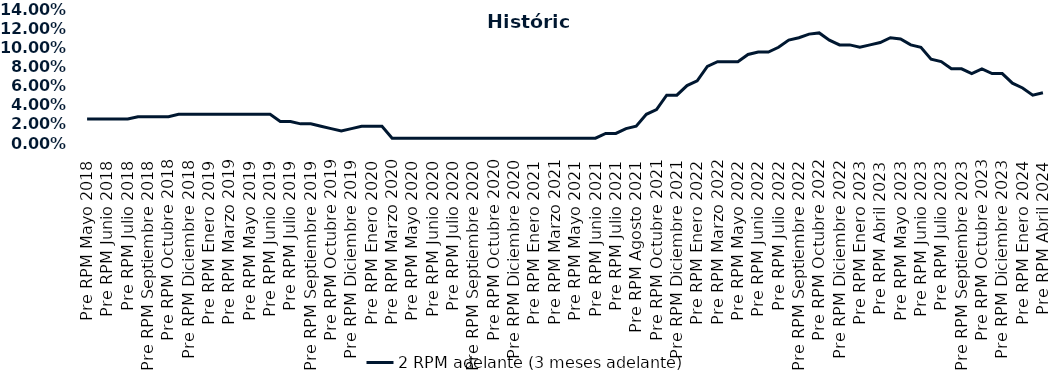
| Category | 2 RPM adelante (3 meses adelante) |
|---|---|
| Pre RPM Mayo 2018 | 0.025 |
| Post RPM Mayo 2018 | 0.025 |
| Pre RPM Junio 2018 | 0.025 |
| Post RPM Junio 2018 | 0.025 |
| Pre RPM Julio 2018 | 0.025 |
| Post RPM Julio 2018 | 0.028 |
| Pre RPM Septiembre 2018 | 0.028 |
| Post RPM Septiembre 2018 | 0.028 |
| Pre RPM Octubre 2018 | 0.028 |
| Post RPM Octubre 2018 | 0.03 |
| Pre RPM Diciembre 2018 | 0.03 |
| Post RPM Diciembre 2018 | 0.03 |
| Pre RPM Enero 2019 | 0.03 |
| Post RPM Enero 2019 | 0.03 |
| Pre RPM Marzo 2019 | 0.03 |
| Post RPM Marzo 2019 | 0.03 |
| Pre RPM Mayo 2019 | 0.03 |
| Post RPM Mayo 2019 | 0.03 |
| Pre RPM Junio 2019 | 0.03 |
| Post RPM Junio 2019 | 0.022 |
| Pre RPM Julio 2019 | 0.022 |
| Post RPM Julio 2019 | 0.02 |
| Pre RPM Septiembre 2019 | 0.02 |
| Post RPM Septiembre 2019 | 0.018 |
| Pre RPM Octubre 2019 | 0.015 |
| Post RPM Octubre 2019 | 0.012 |
| Pre RPM Diciembre 2019 | 0.015 |
| Post RPM Diciembre 2019 | 0.018 |
| Pre RPM Enero 2020 | 0.018 |
| Post RPM Enero 2020 | 0.018 |
| Pre RPM Marzo 2020 | 0.005 |
| Post RPM Marzo 2020 | 0.005 |
| Pre RPM Mayo 2020 | 0.005 |
| Post RPM Mayo 2020 | 0.005 |
| Pre RPM Junio 2020 | 0.005 |
| Post RPM Junio 2020 | 0.005 |
| Pre RPM Julio 2020 | 0.005 |
| Post RPM Julio 2020 | 0.005 |
| Pre RPM Septiembre 2020 | 0.005 |
| Post RPM Septiembre 2020 | 0.005 |
| Pre RPM Octubre 2020 | 0.005 |
| Post RPM Octubre 2020 | 0.005 |
| Pre RPM Diciembre 2020 | 0.005 |
| Post RPM Diciembre 2020 | 0.005 |
| Pre RPM Enero 2021 | 0.005 |
| Post RPM Enero 2021 | 0.005 |
| Pre RPM Marzo 2021 | 0.005 |
| Post RPM Marzo 2021 | 0.005 |
| Pre RPM Mayo 2021 | 0.005 |
| Post RPM Mayo 2021 | 0.005 |
| Pre RPM Junio 2021 | 0.005 |
| Post RPM Junio 2021 | 0.01 |
| Pre RPM Julio 2021 | 0.01 |
| Post RPM Julio 2021 | 0.015 |
| Pre RPM Agosto 2021 | 0.018 |
| Post RPM Agosto 2021 | 0.03 |
| Pre RPM Octubre 2021 | 0.035 |
| Post RPM Octubre 2021 | 0.05 |
| Pre RPM Diciembre 2021 | 0.05 |
| Post RPM Diciembre 2021 | 0.06 |
| Pre RPM Enero 2022 | 0.065 |
| Post RPM Enero 2022 | 0.08 |
| Pre RPM Marzo 2022 | 0.085 |
| Post RPM Marzo 2022 | 0.085 |
| Pre RPM Mayo 2022 | 0.085 |
| Post RPM Mayo 2022 | 0.092 |
| Pre RPM Junio 2022 | 0.095 |
| Post RPM Junio 2022 | 0.095 |
| Pre RPM Julio 2022 | 0.1 |
| Post RPM Julio 2022 | 0.108 |
| Pre RPM Septiembre 2022 | 0.11 |
| Post RPM Septiembre 2022 | 0.114 |
| Pre RPM Octubre 2022 | 0.115 |
| Post RPM Octubre 2022 | 0.108 |
| Pre RPM Diciembre 2022 | 0.102 |
| Post RPM Diciembre 2022 | 0.102 |
| Pre RPM Enero 2023 | 0.1 |
| Post RPM Enero 2023 | 0.102 |
| Pre RPM Abril 2023 | 0.105 |
| Post RPM Abril 2023 | 0.11 |
| Pre RPM Mayo 2023 | 0.109 |
| Post RPM Mayo 2023 | 0.102 |
| Pre RPM Junio 2023 | 0.1 |
| Post RPM Junio 2023 | 0.088 |
| Pre RPM Julio 2023 | 0.085 |
| Post RPM Julio 2023 | 0.078 |
| Pre RPM Septiembre 2023 | 0.078 |
| Post RPM Septiembre 2023 | 0.072 |
| Pre RPM Octubre 2023 | 0.078 |
| Post RPM Octubre 2023 | 0.072 |
| Pre RPM Diciembre 2023 | 0.072 |
| Post RPM Diciembre 2023 | 0.062 |
| Pre RPM Enero 2024 | 0.058 |
| Post RPM Enero 2024 | 0.05 |
| Pre RPM Abril 2024 | 0.052 |